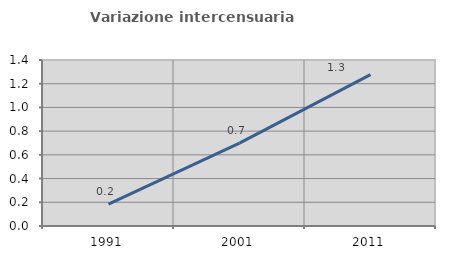
| Category | Variazione intercensuaria annua |
|---|---|
| 1991.0 | 0.185 |
| 2001.0 | 0.699 |
| 2011.0 | 1.277 |